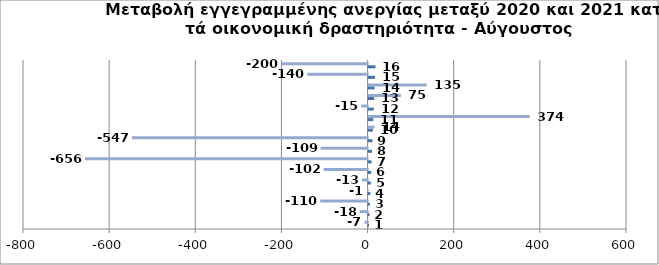
| Category | Series 0 | Series 1 |
|---|---|---|
| 0 | 1 | -7 |
| 1 | 2 | -18 |
| 2 | 3 | -110 |
| 3 | 4 | -1 |
| 4 | 5 | -13 |
| 5 | 6 | -102 |
| 6 | 7 | -656 |
| 7 | 8 | -109 |
| 8 | 9 | -547 |
| 9 | 10 | 14 |
| 10 | 11 | 374 |
| 11 | 12 | -15 |
| 12 | 13 | 75 |
| 13 | 14 | 135 |
| 14 | 15 | -140 |
| 15 | 16 | -200 |